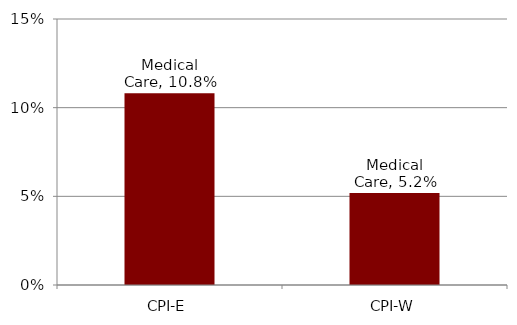
| Category | Medical Care |
|---|---|
| CPI-E | 0.108 |
| CPI-W | 0.052 |